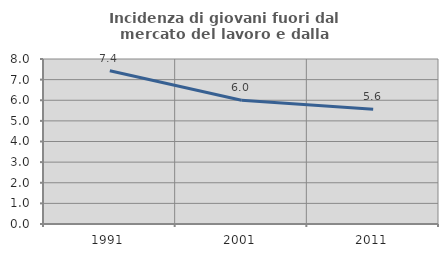
| Category | Incidenza di giovani fuori dal mercato del lavoro e dalla formazione  |
|---|---|
| 1991.0 | 7.427 |
| 2001.0 | 6.002 |
| 2011.0 | 5.568 |